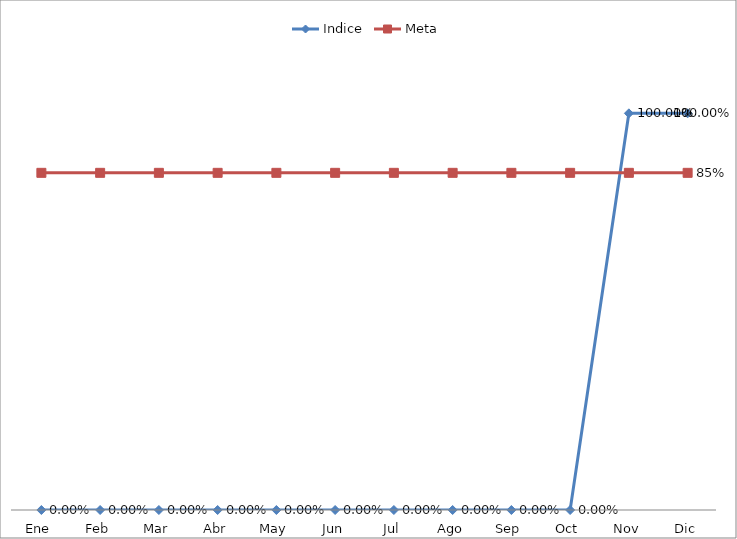
| Category | Indice | Meta |
|---|---|---|
| Ene | 0 | 0.85 |
| Feb | 0 | 0.85 |
| Mar | 0 | 0.85 |
| Abr | 0 | 0.85 |
| May | 0 | 0.85 |
| Jun | 0 | 0.85 |
| Jul | 0 | 0.85 |
| Ago | 0 | 0.85 |
| Sep | 0 | 0.85 |
| Oct | 0 | 0.85 |
| Nov | 1 | 0.85 |
| Dic | 1 | 0.85 |